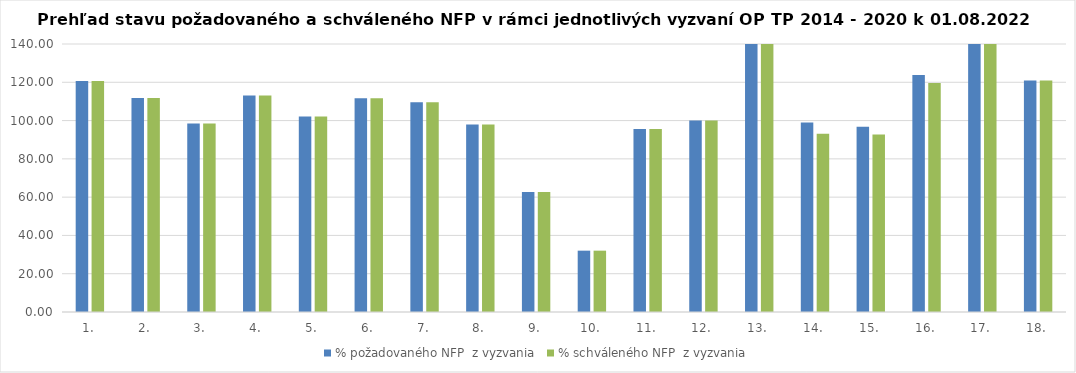
| Category | % požadovaného NFP  z vyzvania | % schváleného NFP  z vyzvania |
|---|---|---|
| 1. | 120.673 | 120.673 |
| 2. | 111.84 | 111.84 |
| 3. | 98.474 | 98.474 |
| 4. | 113.162 | 113.162 |
| 5. | 102.19 | 102.19 |
| 6. | 111.66 | 111.66 |
| 7. | 109.515 | 109.515 |
| 8. | 97.998 | 97.998 |
| 9. | 62.727 | 62.727 |
| 10. | 32.041 | 32.041 |
| 11. | 95.621 | 95.621 |
| 12. | 100.009 | 100.009 |
| 13. | 151.956 | 151.956 |
| 14. | 99.048 | 93.16 |
| 15. | 96.713 | 92.671 |
| 16. | 123.771 | 119.605 |
| 17. | 171.931 | 171.931 |
| 18. | 120.879 | 120.879 |